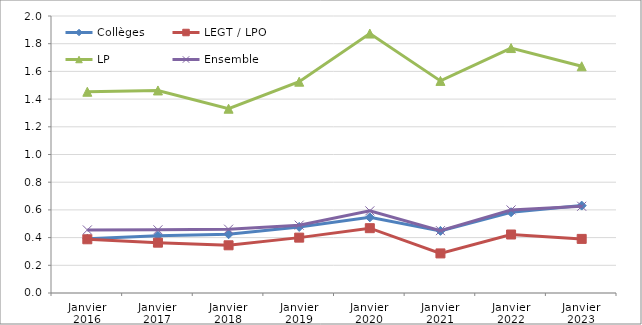
| Category | Collèges | LEGT / LPO | LP  | Ensemble |
|---|---|---|---|---|
| Janvier 2016 | 0.392 | 0.388 | 1.453 | 0.455 |
| Janvier 2017 | 0.413 | 0.363 | 1.462 | 0.456 |
| Janvier 2018 | 0.424 | 0.344 | 1.331 | 0.461 |
| Janvier 2019 | 0.477 | 0.4 | 1.526 | 0.49 |
| Janvier 2020 | 0.546 | 0.468 | 1.873 | 0.593 |
| Janvier 2021 | 0.449 | 0.286 | 1.531 | 0.45 |
| Janvier 2022 | 0.583 | 0.422 | 1.769 | 0.6 |
| Janvier 2023 | 0.631 | 0.391 | 1.637 | 0.626 |